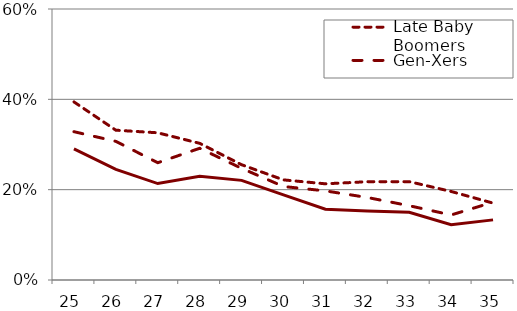
| Category | Late Baby Boomers | Gen-Xers | Millennials |
|---|---|---|---|
| 25.0 | 0.394 | 0.328 | 0.29 |
| 26.0 | 0.332 | 0.307 | 0.245 |
| 27.0 | 0.326 | 0.26 | 0.214 |
| 28.0 | 0.303 | 0.292 | 0.23 |
| 29.0 | 0.255 | 0.247 | 0.221 |
| 30.0 | 0.222 | 0.207 | 0.188 |
| 31.0 | 0.213 | 0.197 | 0.157 |
| 32.0 | 0.218 | 0.183 | 0.153 |
| 33.0 | 0.218 | 0.164 | 0.15 |
| 34.0 | 0.196 | 0.144 | 0.122 |
| 35.0 | 0.17 | 0.172 | 0.133 |